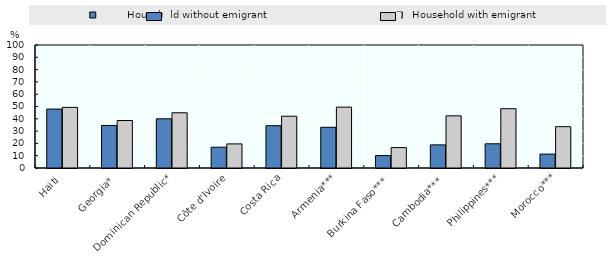
| Category |          Household without emigrant |   Household with emigrant |
|---|---|---|
| Haiti | 47.9 | 49.3 |
| Georgia* | 34.6 | 38.6 |
| Dominican Republic* | 40 | 44.9 |
| Côte d'Ivoire | 16.9 | 19.6 |
| Costa Rica | 34.4 | 42.1 |
| Armenia*** | 33.1 | 49.5 |
| Burkina Faso*** | 10.1 | 16.6 |
| Cambodia*** | 18.8 | 42.4 |
| Philippines*** | 19.7 | 48.2 |
| Morocco*** | 11.3 | 33.6 |